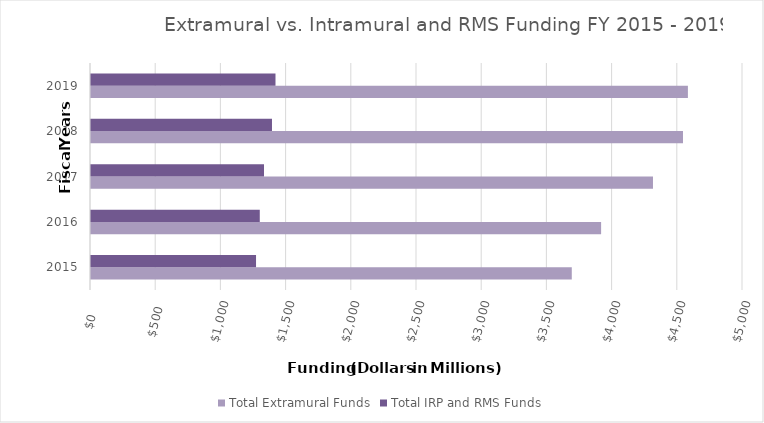
| Category | Total Extramural Funds | Total IRP and RMS Funds |
|---|---|---|
| 2015.0 | 3686.968 | 1265.633 |
| 2016.0 | 3911.872 | 1294.293 |
| 2017.0 | 4309.659 | 1326.733 |
| 2018.0 | 4539.773 | 1387.911 |
| 2019.0 | 4577.498 | 1414.788 |